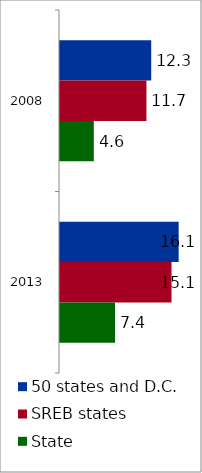
| Category | 50 states and D.C. | SREB states | State |
|---|---|---|---|
| 2008 | 12.344 | 11.699 | 4.576 |
| 2013 | 16.06 | 15.093 | 7.445 |